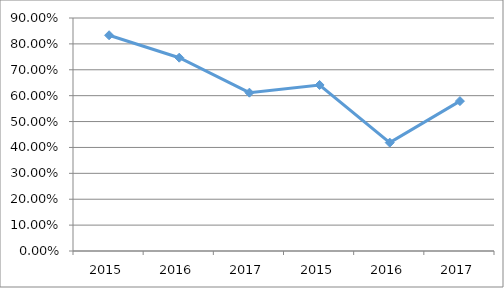
| Category | MFLU-F3O29 |
|---|---|
| 2015.0 | 0.833 |
| 2016.0 | 0.747 |
| 2017.0 | 0.612 |
| 2015.0 | 0.641 |
| 2016.0 | 0.419 |
| 2017.0 | 0.579 |